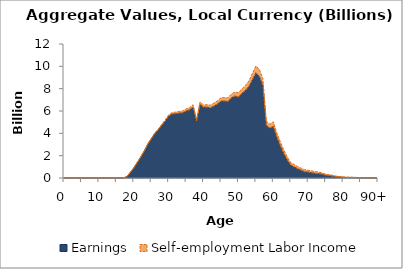
| Category | Earnings | Self-employment Labor Income |
|---|---|---|
| 0 | 0 | 0 |
|  | 0 | 0 |
| 2 | 0 | 0 |
| 3 | 0 | 0 |
| 4 | 0 | 0 |
| 5 | 0 | 0 |
| 6 | 0 | 0 |
| 7 | 0 | 0 |
| 8 | 0 | 0 |
| 9 | 0 | 0 |
| 10 | 0 | 0 |
| 11 | 0 | 0 |
| 12 | 0 | 0 |
| 13 | 0 | 0 |
| 14 | 0 | 0 |
| 15 | 0 | 0 |
| 16 | 0.955 | 0 |
| 17 | 6.173 | 0 |
| 18 | 120.045 | 2.519 |
| 19 | 492.787 | 1.365 |
| 20 | 898.489 | 4.747 |
| 21 | 1391.826 | 8.456 |
| 22 | 1883.045 | 13.518 |
| 23 | 2405.674 | 28.51 |
| 24 | 3021.914 | 36.194 |
| 25 | 3491.655 | 46.165 |
| 26 | 3970.824 | 54.843 |
| 27 | 4319.483 | 61.193 |
| 28 | 4725.108 | 63.268 |
| 29 | 5104.153 | 87.306 |
| 30 | 5554.421 | 99.316 |
| 31 | 5742.353 | 115.513 |
| 32 | 5765.991 | 132.562 |
| 33 | 5816.239 | 157.653 |
| 34 | 5837.761 | 164.522 |
| 35 | 6007.656 | 180.79 |
| 36 | 6111.708 | 183.602 |
| 37 | 6363.625 | 198.383 |
| 38 | 5103.661 | 148.259 |
| 39 | 6612.81 | 194.232 |
| 40 | 6345.886 | 193.372 |
| 41 | 6352.816 | 216.161 |
| 42 | 6295.367 | 224.644 |
| 43 | 6458.745 | 259.208 |
| 44 | 6636.506 | 274.355 |
| 45 | 6896.914 | 295.583 |
| 46 | 6894.936 | 310.083 |
| 47 | 6857.88 | 311.312 |
| 48 | 7191.088 | 330.941 |
| 49 | 7347.378 | 348.18 |
| 50 | 7252.875 | 372.585 |
| 51 | 7589.666 | 394.574 |
| 52 | 7848.928 | 437.354 |
| 53 | 8215.765 | 471.91 |
| 54 | 8816.791 | 547.646 |
| 55 | 9428.068 | 603.444 |
| 56 | 9106.469 | 606.484 |
| 57 | 8335.103 | 567.523 |
| 58 | 4727.649 | 340.396 |
| 59 | 4466.985 | 351.2 |
| 60 | 4634.599 | 400.288 |
| 61 | 3682.085 | 359.497 |
| 62 | 2913.078 | 342.65 |
| 63 | 2203.868 | 315.025 |
| 64 | 1635.524 | 254.088 |
| 65 | 1172.062 | 204.583 |
| 66 | 995.914 | 210.152 |
| 67 | 828.997 | 196.153 |
| 68 | 703.842 | 178.663 |
| 69 | 556.092 | 185.469 |
| 70 | 537.267 | 162.831 |
| 71 | 473.559 | 161.401 |
| 72 | 418.948 | 150.838 |
| 73 | 398.197 | 140.248 |
| 74 | 342.613 | 107.71 |
| 75 | 246.927 | 100.956 |
| 76 | 218.822 | 83.97 |
| 77 | 170.731 | 70.397 |
| 78 | 112.783 | 57.577 |
| 79 | 93.344 | 42.19 |
| 80 | 64.103 | 31.598 |
| 81 | 50.501 | 24.082 |
| 82 | 49.794 | 21.725 |
| 83 | 46.554 | 17.189 |
| 84 | 34.924 | 14.04 |
| 85 | 23.104 | 6.495 |
| 86 | 15.93 | 3.289 |
| 87 | 7.694 | 0.757 |
| 88 | 3.605 | 0 |
| 89 | 3.211 | 0 |
| 90+ | 12.658 | 0 |